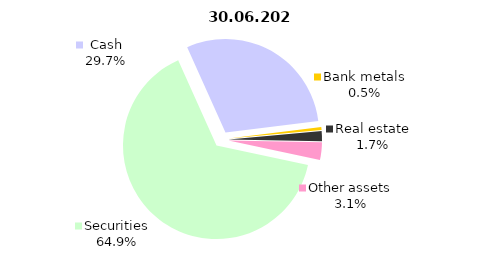
| Category | Total |
|---|---|
| Securities | 1342.281 |
| Cash | 614.713 |
| Bank metals | 10.719 |
| Real estate | 35.947 |
| Other assets | 63.093 |